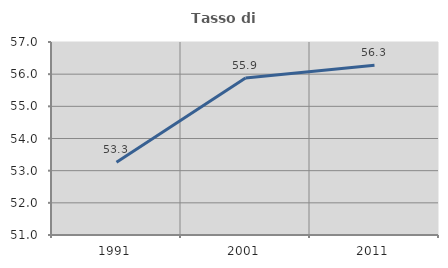
| Category | Tasso di occupazione   |
|---|---|
| 1991.0 | 53.264 |
| 2001.0 | 55.884 |
| 2011.0 | 56.277 |